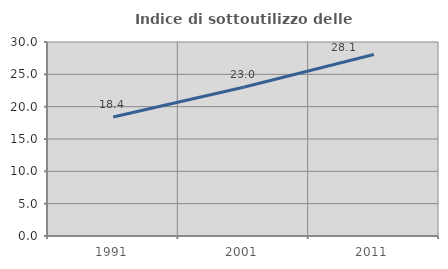
| Category | Indice di sottoutilizzo delle abitazioni  |
|---|---|
| 1991.0 | 18.408 |
| 2001.0 | 23.012 |
| 2011.0 | 28.062 |